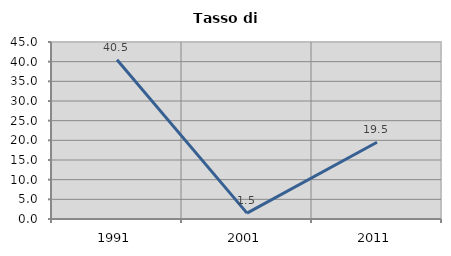
| Category | Tasso di disoccupazione   |
|---|---|
| 1991.0 | 40.481 |
| 2001.0 | 1.493 |
| 2011.0 | 19.518 |